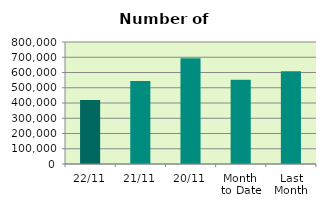
| Category | Series 0 |
|---|---|
| 22/11 | 419186 |
| 21/11 | 543878 |
| 20/11 | 694006 |
| Month 
to Date | 552494.25 |
| Last
Month | 607838.609 |